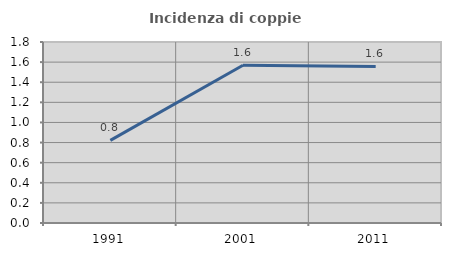
| Category | Incidenza di coppie miste |
|---|---|
| 1991.0 | 0.822 |
| 2001.0 | 1.569 |
| 2011.0 | 1.557 |